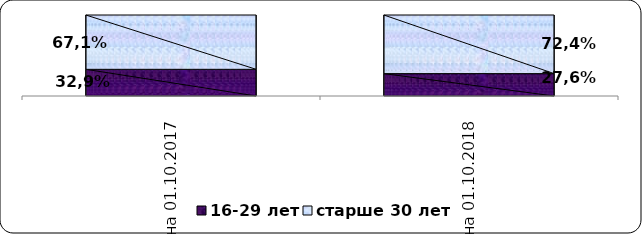
| Category | 16-29 лет | старше 30 лет |
|---|---|---|
| на 01.10.2017  | 0.329 | 0.671 |
| на 01.10.2018  | 0.276 | 0.724 |